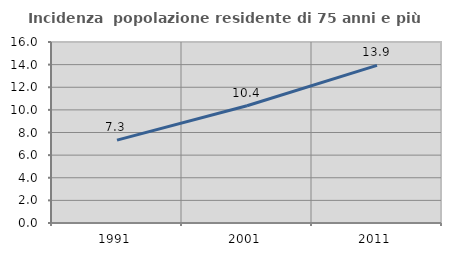
| Category | Incidenza  popolazione residente di 75 anni e più |
|---|---|
| 1991.0 | 7.325 |
| 2001.0 | 10.367 |
| 2011.0 | 13.935 |